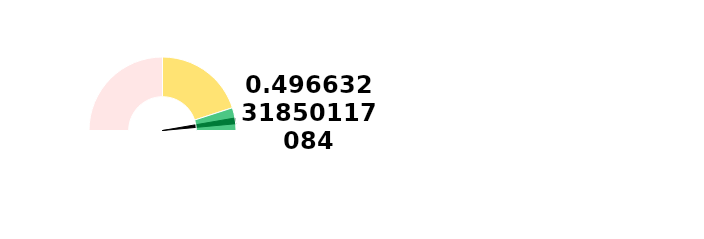
| Category | Ponteiro |
|---|---|
| 0 | 96.788 |
| 1 | 2.5 |
| 2 | 100.712 |